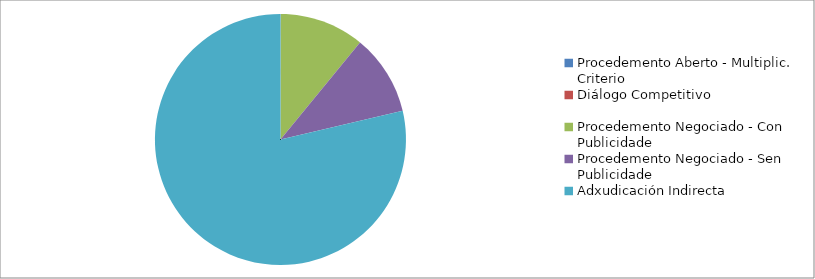
| Category | Series 0 | Series 1 |
|---|---|---|
| Procedemento Aberto - Multiplic. Criterio | 1000 | 0 |
| Diálogo Competitivo | 0 | 0 |
| Procedemento Negociado - Con Publicidade | 504658.92 | 0.109 |
| Procedemento Negociado - Sen Publicidade | 481892.22 | 0.104 |
| Adxudicación Indirecta | 3642909.61 | 0.787 |